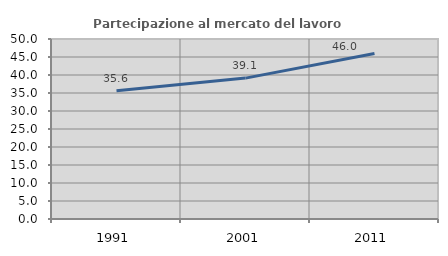
| Category | Partecipazione al mercato del lavoro  femminile |
|---|---|
| 1991.0 | 35.644 |
| 2001.0 | 39.136 |
| 2011.0 | 45.991 |